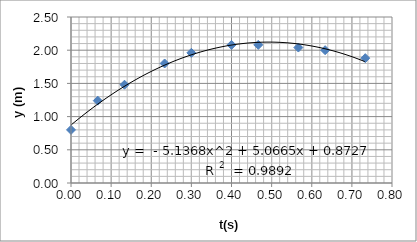
| Category | Series 0 |
|---|---|
| 0.0 | 0.8 |
| 0.06666666666666667 | 1.24 |
| 0.13333333333333333 | 1.48 |
| 0.23333333333333334 | 1.8 |
| 0.3 | 1.96 |
| 0.4 | 2.08 |
| 0.4666666666666667 | 2.08 |
| 0.5666666666666667 | 2.04 |
| 0.6333333333333333 | 2 |
| 0.7333333333333333 | 1.88 |